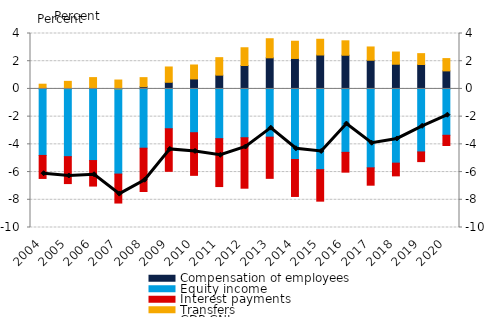
| Category | Compensation of employees | Equity income | Interest payments | Transfers |
|---|---|---|---|---|
| 2004.0 | 0.05 | -4.8 | -1.66 | 0.291 |
| 2005.0 | 0.026 | -4.888 | -1.943 | 0.52 |
| 2006.0 | 0.074 | -5.169 | -1.842 | 0.743 |
| 2007.0 | 0.004 | -6.146 | -2.089 | 0.638 |
| 2008.0 | 0.158 | -4.278 | -3.124 | 0.657 |
| 2009.0 | 0.48 | -2.874 | -3.072 | 1.104 |
| 2010.0 | 0.721 | -3.16 | -3.076 | 1.006 |
| 2011.0 | 0.993 | -3.59 | -3.455 | 1.264 |
| 2012.0 | 1.689 | -3.522 | -3.642 | 1.282 |
| 2013.0 | 2.245 | -3.481 | -2.972 | 1.377 |
| 2014.0 | 2.199 | -5.091 | -2.669 | 1.243 |
| 2015.0 | 2.447 | -5.826 | -2.273 | 1.137 |
| 2016.0 | 2.431 | -4.577 | -1.429 | 1.041 |
| 2017.0 | 2.071 | -5.694 | -1.253 | 0.958 |
| 2018.0 | 1.782 | -5.357 | -0.917 | 0.881 |
| 2019.0 | 1.762 | -4.546 | -0.698 | 0.785 |
| 2020.0 | 1.302 | -3.345 | -0.739 | 0.888 |